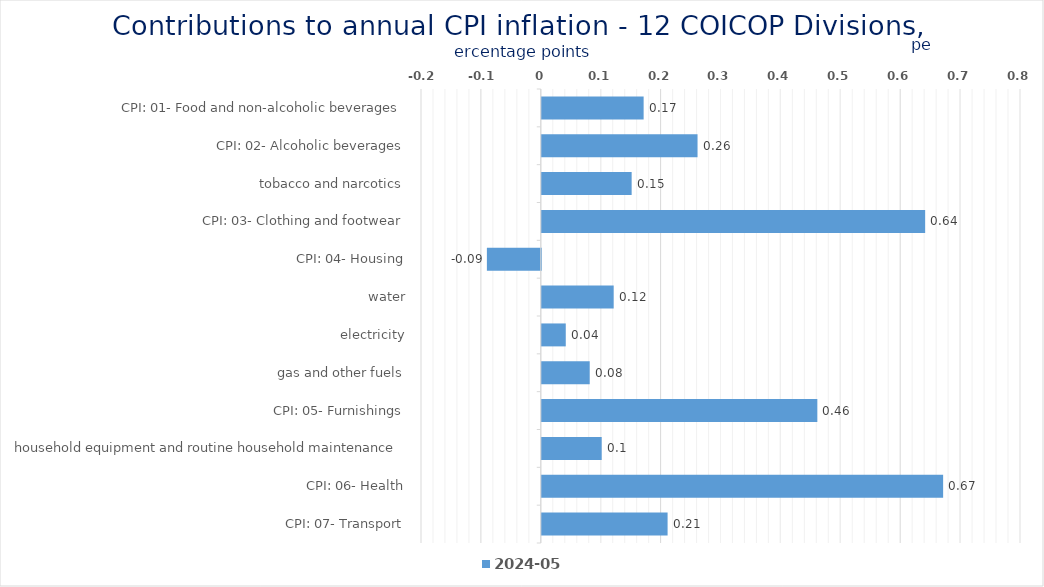
| Category | 2024-05 |
|---|---|
| CPI: 01- Food and non-alcoholic beverages | 0.17 |
| CPI: 02- Alcoholic beverages, tobacco and narcotics | 0.26 |
| CPI: 03- Clothing and footwear | 0.15 |
| CPI: 04- Housing, water, electricity, gas and other fuels | 0.64 |
| CPI: 05- Furnishings, household equipment and routine household maintenance | -0.09 |
| CPI: 06- Health | 0.12 |
| CPI: 07- Transport | 0.04 |
| CPI: 08- Communication | 0.08 |
| CPI: 09- Recreation and culture | 0.46 |
| CPI: 10- Education | 0.1 |
| CPI: 11- Restaurants and hotels | 0.67 |
| CPI: 12- Miscellaneous goods and services | 0.21 |